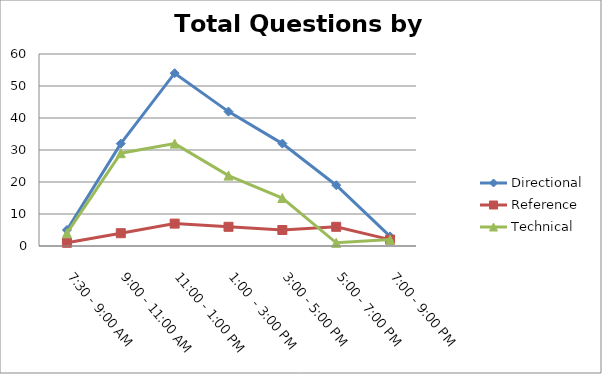
| Category | Directional | Reference | Technical |
|---|---|---|---|
| 7:30 - 9:00 AM | 5 | 1 | 4 |
| 9:00 - 11:00 AM | 32 | 4 | 29 |
| 11:00 - 1:00 PM | 54 | 7 | 32 |
| 1:00  - 3:00 PM | 42 | 6 | 22 |
| 3:00 - 5:00 PM | 32 | 5 | 15 |
| 5:00 - 7:00 PM | 19 | 6 | 1 |
| 7:00 - 9:00 PM | 3 | 2 | 2 |